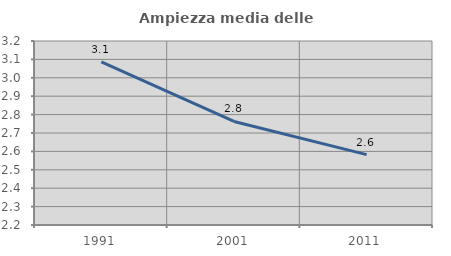
| Category | Ampiezza media delle famiglie |
|---|---|
| 1991.0 | 3.087 |
| 2001.0 | 2.763 |
| 2011.0 | 2.582 |